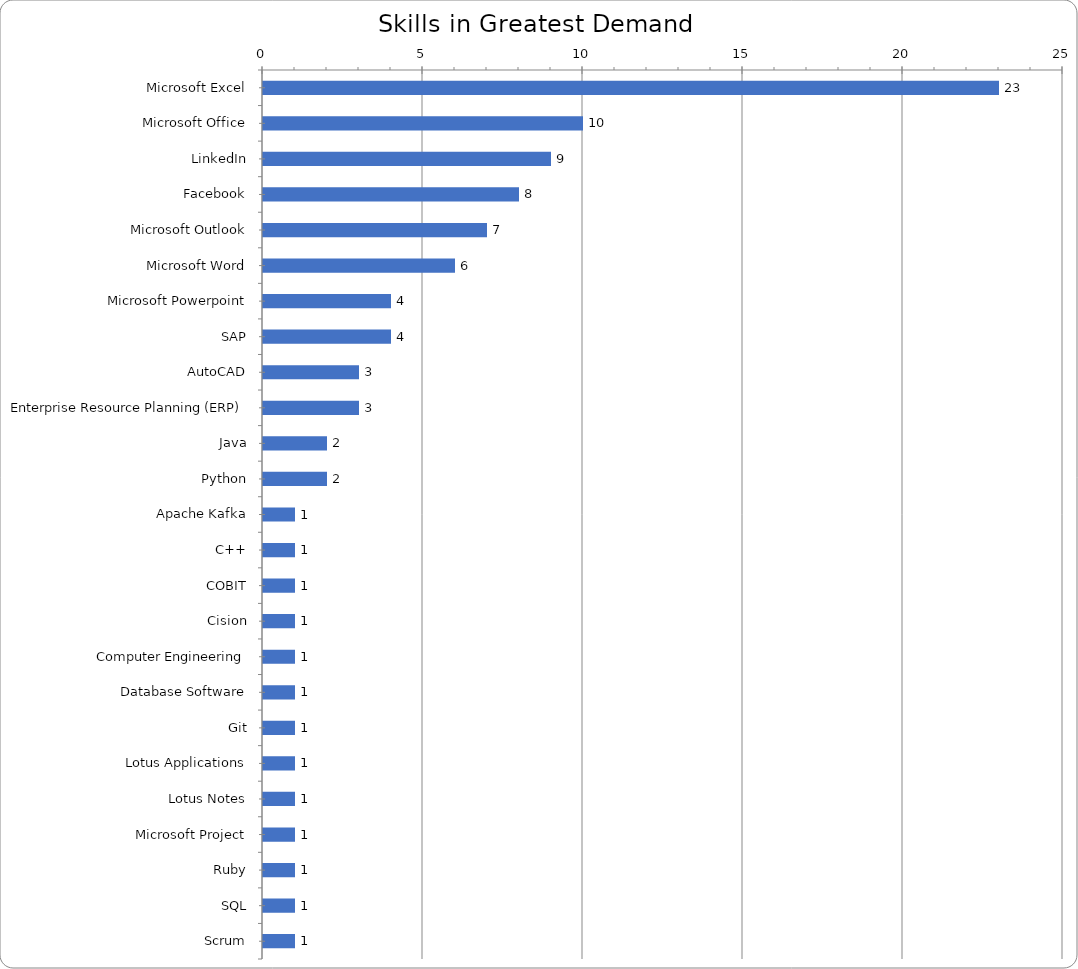
| Category | Series 0 |
|---|---|
| Microsoft Excel | 23 |
| Microsoft Office | 10 |
| LinkedIn | 9 |
| Facebook | 8 |
| Microsoft Outlook | 7 |
| Microsoft Word | 6 |
| Microsoft Powerpoint | 4 |
| SAP | 4 |
| AutoCAD | 3 |
| Enterprise Resource Planning (ERP) | 3 |
| Java | 2 |
| Python | 2 |
| Apache Kafka | 1 |
| C++ | 1 |
| COBIT | 1 |
| Cision | 1 |
| Computer Engineering | 1 |
| Database Software | 1 |
| Git | 1 |
| Lotus Applications | 1 |
| Lotus Notes | 1 |
| Microsoft Project | 1 |
| Ruby | 1 |
| SQL | 1 |
| Scrum | 1 |